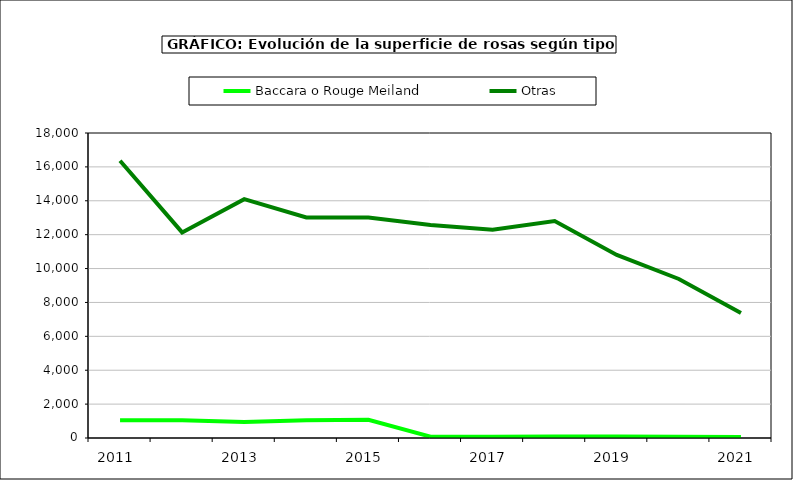
| Category | Baccara o Rouge Meiland | Otras |
|---|---|---|
| 2011.0 | 1050 | 16360 |
| 2012.0 | 1050 | 12133 |
| 2013.0 | 950 | 14093 |
| 2014.0 | 1050 | 13013 |
| 2015.0 | 1070 | 13016 |
| 2016.0 | 79 | 12572 |
| 2017.0 | 79 | 12292 |
| 2018.0 | 93 | 12802 |
| 2019.0 | 91 | 10801 |
| 2020.0 | 74 | 9385 |
| 2021.0 | 66 | 7381 |